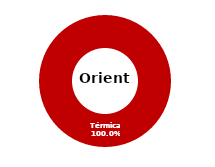
| Category | Oriente |
|---|---|
| Eólica | 0 |
| Hidráulica | 0 |
| Solar | 0 |
| Térmica | 68.02 |